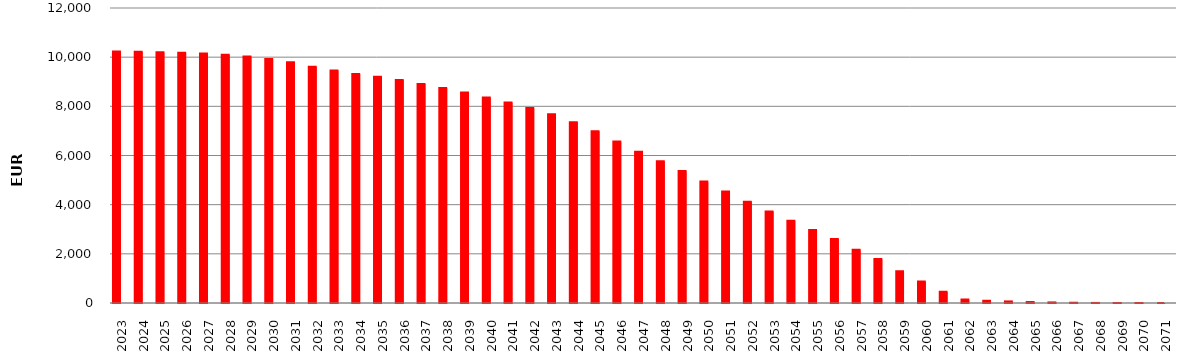
| Category | 10236992092 | SumOfMont Cred Ced act |
|---|---|---|
| 2023.0 | 10232990879.48 | 4001212.08 |
| 2024.0 | 10221751956.92 | 11238922.56 |
| 2025.0 | 10204857263.22 | 16894693.7 |
| 2026.0 | 10181285528.13 | 23571735.09 |
| 2027.0 | 10146549686.97 | 34735841.16 |
| 2028.0 | 10099939663.19 | 46610023.78 |
| 2029.0 | 10024107949.13 | 75831714.06 |
| 2030.0 | 9921364789.26 | 102743159.87 |
| 2031.0 | 9788442174.22 | 132922615.04 |
| 2032.0 | 9607638798.17 | 180803376.05 |
| 2033.0 | 9459087089.59 | 148551708.58 |
| 2034.0 | 9319263486.98 | 139823602.61 |
| 2035.0 | 9199998193.5 | 119265293.48 |
| 2036.0 | 9070469160.23 | 129529033.27 |
| 2037.0 | 8912528017.44 | 157941142.79 |
| 2038.0 | 8747611960.13 | 164916057.31 |
| 2039.0 | 8565249261.57 | 182362698.56 |
| 2040.0 | 8359847328.91 | 205401932.66 |
| 2041.0 | 8158012351.77 | 201834977.14 |
| 2042.0 | 7935542774.62 | 222469577.15 |
| 2043.0 | 7680917912.73 | 254624861.89 |
| 2044.0 | 7348496894.07 | 332421018.66 |
| 2045.0 | 6991478789.31 | 357018104.76 |
| 2046.0 | 6572236730.91 | 419242058.4 |
| 2047.0 | 6154990404.7 | 417246326.21 |
| 2048.0 | 5762534022.8 | 392456381.9 |
| 2049.0 | 5370203019.58 | 392331003.22 |
| 2050.0 | 4946989504.89 | 423213514.69 |
| 2051.0 | 4539590601.26 | 407398903.63 |
| 2052.0 | 4116509450.42 | 423081150.84 |
| 2053.0 | 3722904004.44 | 393605445.98 |
| 2054.0 | 3345580789.58 | 377323214.86 |
| 2055.0 | 2970818603.49 | 374762186.09 |
| 2056.0 | 2602169733.5 | 368648869.99 |
| 2057.0 | 2166774850.88 | 435394882.62 |
| 2058.0 | 1784915510.56 | 381859340.32 |
| 2059.0 | 1289882858.61 | 495032651.95 |
| 2060.0 | 874327400.87 | 415555457.74 |
| 2061.0 | 456073490.21 | 418253910.66 |
| 2062.0 | 138223340.24 | 317850149.97 |
| 2063.0 | 92937044.37 | 45286295.87 |
| 2064.0 | 63562796.51 | 29374247.86 |
| 2065.0 | 39110925.61 | 24451870.9 |
| 2066.0 | 23799656.46 | 15311269.15 |
| 2067.0 | 10704962.45 | 13094694.01 |
| 2068.0 | 2277840.33 | 8427122.12 |
| 2069.0 | 641982.34 | 1635857.99 |
| 2070.0 | 139440.68 | 502541.66 |
| 2071.0 | 0 | 139440.68 |